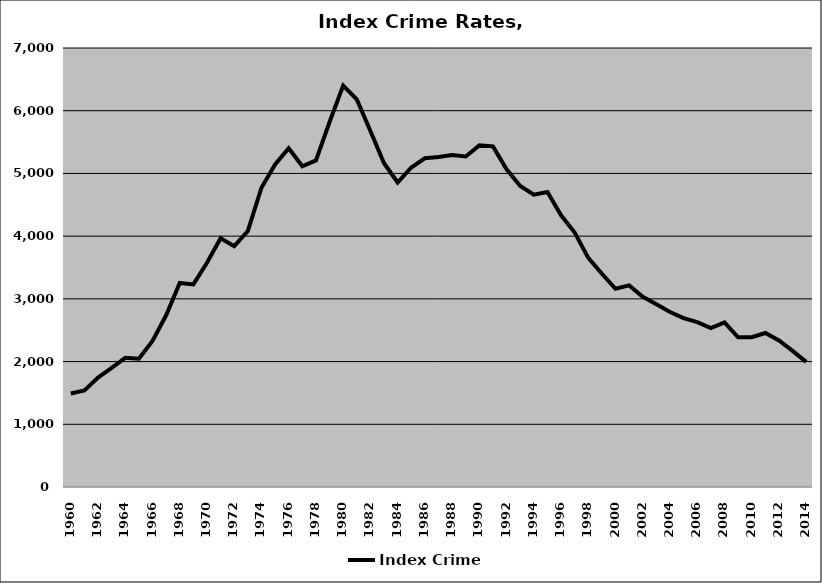
| Category | Index Crime |
|---|---|
| 1960.0 | 1490.757 |
| 1961.0 | 1538.389 |
| 1962.0 | 1743.779 |
| 1963.0 | 1899.026 |
| 1964.0 | 2059.174 |
| 1965.0 | 2046.59 |
| 1966.0 | 2328.53 |
| 1967.0 | 2737.684 |
| 1968.0 | 3254.323 |
| 1969.0 | 3230.652 |
| 1970.0 | 3575.351 |
| 1971.0 | 3965.288 |
| 1972.0 | 3840.016 |
| 1973.0 | 4082.489 |
| 1974.0 | 4771.678 |
| 1975.0 | 5144.3 |
| 1976.0 | 5400.518 |
| 1977.0 | 5113.863 |
| 1978.0 | 5207.152 |
| 1979.0 | 5820.581 |
| 1980.0 | 6401.328 |
| 1981.0 | 6179.8 |
| 1982.0 | 5676.136 |
| 1983.0 | 5163.364 |
| 1984.0 | 4855.489 |
| 1985.0 | 5094.406 |
| 1986.0 | 5241.299 |
| 1987.0 | 5261.496 |
| 1988.0 | 5295.337 |
| 1989.0 | 5269.429 |
| 1990.0 | 5447.216 |
| 1991.0 | 5431.302 |
| 1992.0 | 5064.36 |
| 1993.0 | 4800.825 |
| 1994.0 | 4660.931 |
| 1995.0 | 4703.688 |
| 1996.0 | 4332.949 |
| 1997.0 | 4057.01 |
| 1998.0 | 3654.097 |
| 1999.0 | 3399.963 |
| 2000.0 | 3160.494 |
| 2001.0 | 3215.148 |
| 2002.0 | 3031.596 |
| 2003.0 | 2913.978 |
| 2004.0 | 2789.308 |
| 2005.0 | 2692.244 |
| 2006.0 | 2628.534 |
| 2007.0 | 2533.468 |
| 2008.0 | 2625.736 |
| 2009.0 | 2387.129 |
| 2010.0 | 2389.667 |
| 2011.0 | 2455.321 |
| 2012.0 | 2336.647 |
| 2013.0 | 2170.027 |
| 2014.0 | 1995.251 |